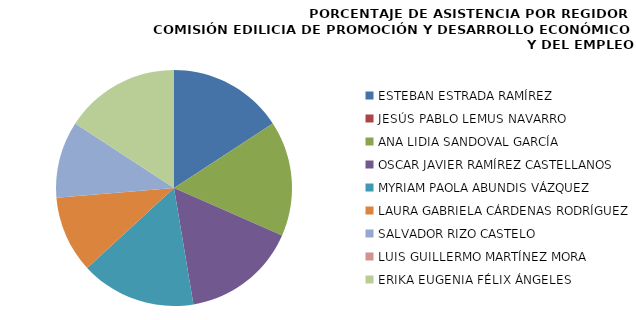
| Category | Series 0 |
|---|---|
| ESTEBAN ESTRADA RAMÍREZ | 100 |
| JESÚS PABLO LEMUS NAVARRO | 0 |
| ANA LIDIA SANDOVAL GARCÍA | 100 |
| OSCAR JAVIER RAMÍREZ CASTELLANOS | 100 |
| MYRIAM PAOLA ABUNDIS VÁZQUEZ | 100 |
| LAURA GABRIELA CÁRDENAS RODRÍGUEZ | 66.667 |
| SALVADOR RIZO CASTELO | 66.667 |
| LUIS GUILLERMO MARTÍNEZ MORA | 0 |
| ERIKA EUGENIA FÉLIX ÁNGELES | 100 |